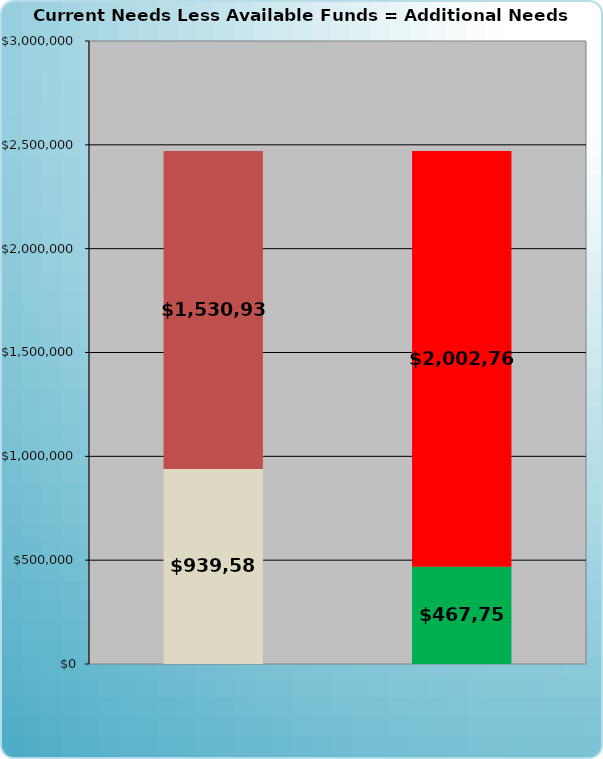
| Category | Series 0 | Series 1 |
|---|---|---|
| 0 | 939583.285 | 1530932.629 |
| 1 | 467755 | 2002760.914 |